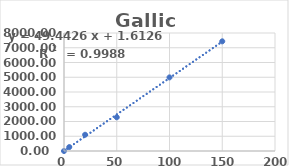
| Category | Area |
|---|---|
| 0.0 | 0 |
| 5.0 | 266.05 |
| 20.0 | 1101.04 |
| 50.0 | 2285.12 |
| 100.0 | 4990.5 |
| 150.0 | 7435.8 |